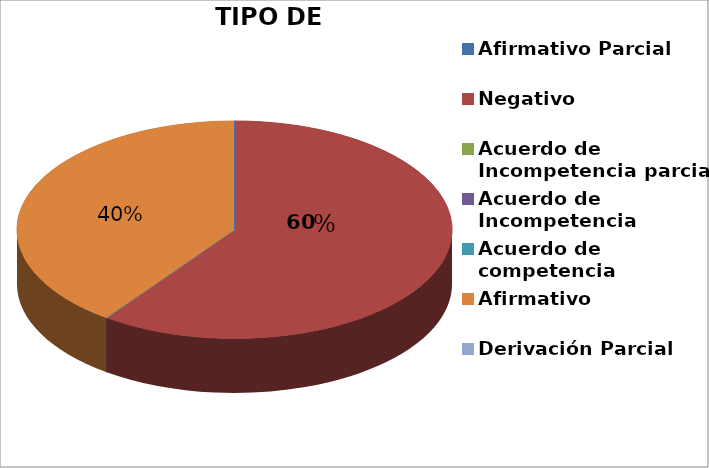
| Category | Series 0 |
|---|---|
| Afirmativo Parcial | 0 |
| Negativo | 3 |
| Acuerdo de Incompetencia parcial | 0 |
| Acuerdo de Incompetencia | 0 |
| Acuerdo de competencia | 0 |
| Afirmativo | 2 |
| Derivación Parcial | 0 |